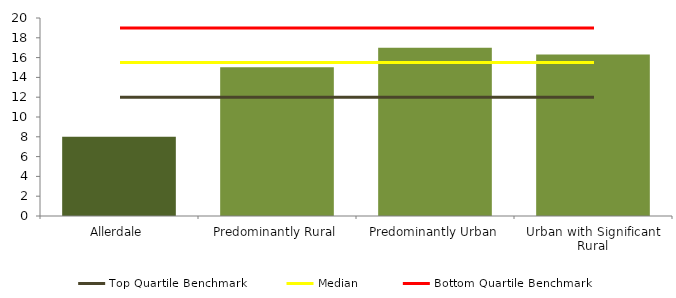
| Category | Series 0 |
|---|---|
| Allerdale | 8 |
| Predominantly Rural | 15.027 |
| Predominantly Urban | 17 |
| Urban with Significant Rural | 16.302 |